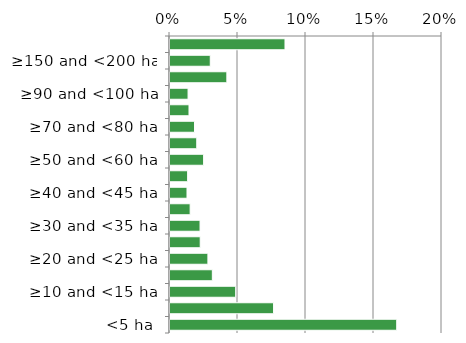
| Category | Native |
|---|---|
| <5 ha | 0.167 |
| ≥5 and <10 ha | 0.076 |
| ≥10 and <15 ha | 0.048 |
| ≥15 and <20 ha | 0.031 |
| ≥20 and <25 ha | 0.028 |
| ≥25 and <30 ha | 0.022 |
| ≥30 and <35 ha | 0.022 |
| ≥35 and <40 ha | 0.015 |
| ≥40 and <45 ha | 0.012 |
| ≥45 and <50 ha | 0.013 |
| ≥50 and <60 ha | 0.025 |
| ≥60 and <70 ha | 0.02 |
| ≥70 and <80 ha | 0.018 |
| ≥80 and <90 ha | 0.014 |
| ≥90 and <100 ha | 0.013 |
| ≥100 and <150 ha | 0.042 |
| ≥150 and <200 ha | 0.03 |
| ≥200 ha | 0.085 |